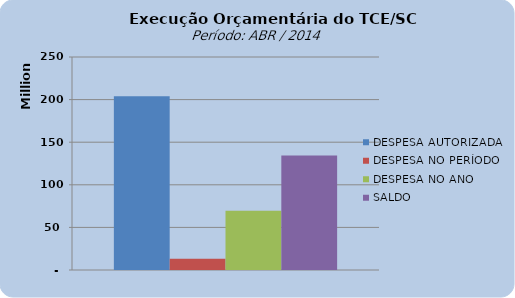
| Category | DESPESA AUTORIZADA | DESPESA NO PERÍODO | DESPESA NO ANO | SALDO |
|---|---|---|---|---|
| 0 | 204043178.21 | 13275402.91 | 69586466.2 | 134456712.01 |